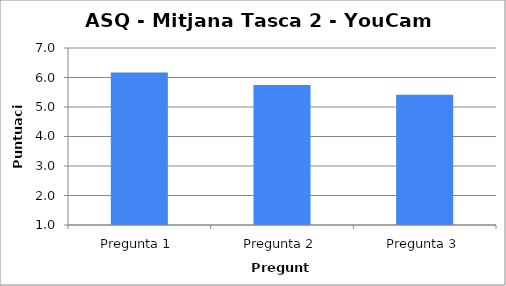
| Category | Series 0 |
|---|---|
| Pregunta 1 | 6.167 |
| Pregunta 2 | 5.75 |
| Pregunta 3 | 5.417 |